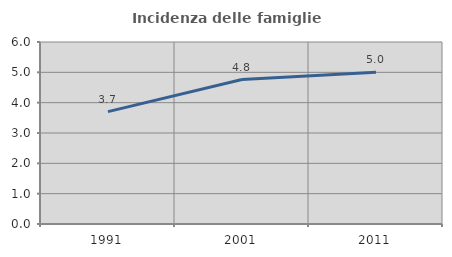
| Category | Incidenza delle famiglie numerose |
|---|---|
| 1991.0 | 3.704 |
| 2001.0 | 4.762 |
| 2011.0 | 5 |